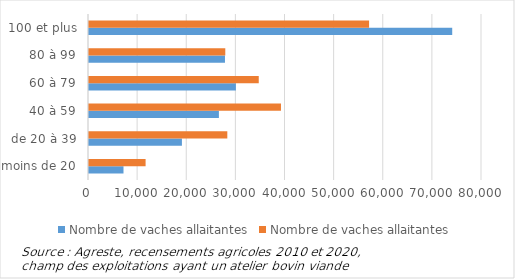
| Category | Nombre de vaches allaitantes |
|---|---|
| moins de 20 | 11521 |
| de 20 à 39 | 28155 |
| 40 à 59 | 39079 |
| 60 à 79 | 34555 |
| 80 à 99 | 27744 |
| 100 et plus | 57014 |